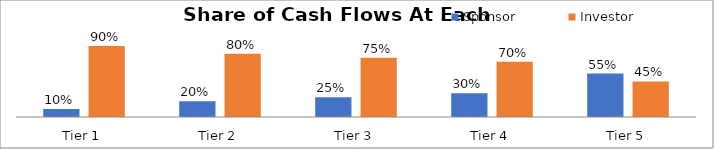
| Category | Sponsor | Investor |
|---|---|---|
| Tier 1 | 0.1 | 0.9 |
| Tier 2 | 0.2 | 0.8 |
| Tier 3 | 0.25 | 0.75 |
| Tier 4 | 0.3 | 0.7 |
| Tier 5 | 0.55 | 0.45 |